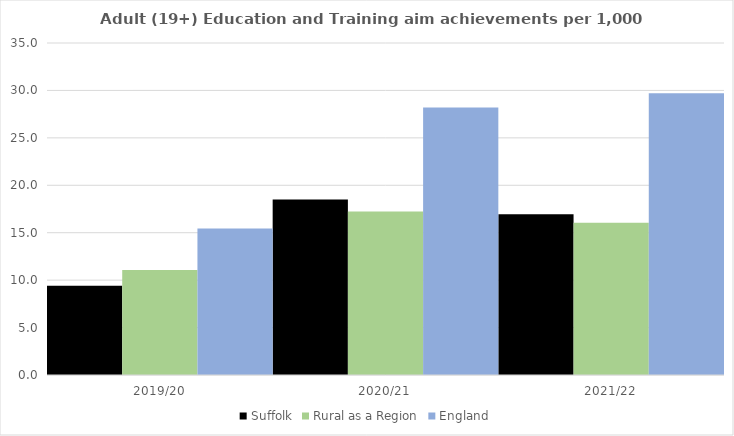
| Category | Suffolk | Rural as a Region | England |
|---|---|---|---|
| 2019/20 | 9.399 | 11.081 | 15.446 |
| 2020/21 | 18.509 | 17.224 | 28.211 |
| 2021/22 | 16.945 | 16.063 | 29.711 |